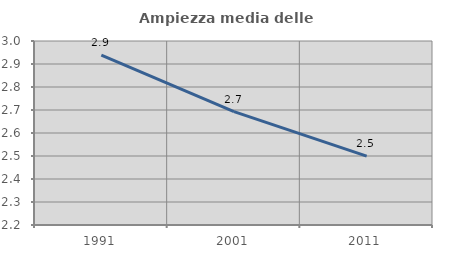
| Category | Ampiezza media delle famiglie |
|---|---|
| 1991.0 | 2.938 |
| 2001.0 | 2.693 |
| 2011.0 | 2.5 |